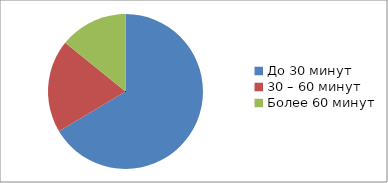
| Category | 1. Сколько времени Вам пришлось потратить, чтобы добраться от дома до поликлиники? |
|---|---|
| До 30 минут | 1078 |
| 30 – 60 минут | 315 |
| Более 60 минут | 230 |